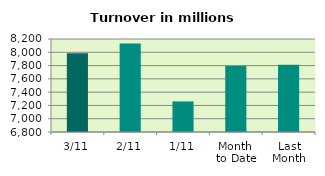
| Category | Series 0 |
|---|---|
| 3/11 | 7986.069 |
| 2/11 | 8133.235 |
| 1/11 | 7260.547 |
| Month 
to Date | 7793.284 |
| Last
Month | 7813.06 |